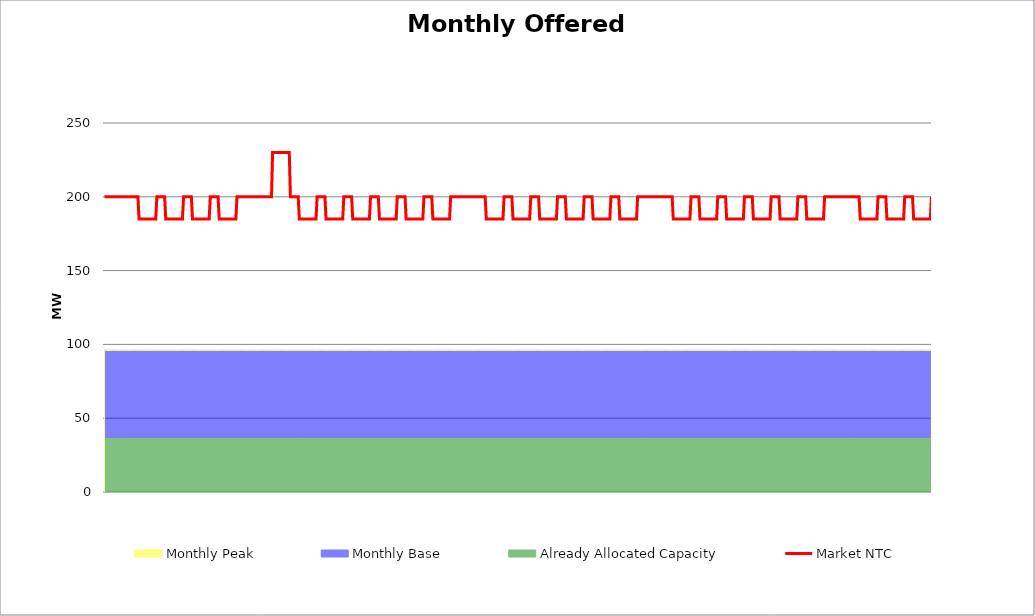
| Category | Market NTC |
|---|---|
| 0 | 200 |
| 1 | 200 |
| 2 | 200 |
| 3 | 200 |
| 4 | 200 |
| 5 | 200 |
| 6 | 200 |
| 7 | 200 |
| 8 | 200 |
| 9 | 200 |
| 10 | 200 |
| 11 | 200 |
| 12 | 200 |
| 13 | 200 |
| 14 | 200 |
| 15 | 200 |
| 16 | 200 |
| 17 | 200 |
| 18 | 200 |
| 19 | 200 |
| 20 | 200 |
| 21 | 200 |
| 22 | 200 |
| 23 | 200 |
| 24 | 200 |
| 25 | 200 |
| 26 | 200 |
| 27 | 200 |
| 28 | 200 |
| 29 | 200 |
| 30 | 200 |
| 31 | 185 |
| 32 | 185 |
| 33 | 185 |
| 34 | 185 |
| 35 | 185 |
| 36 | 185 |
| 37 | 185 |
| 38 | 185 |
| 39 | 185 |
| 40 | 185 |
| 41 | 185 |
| 42 | 185 |
| 43 | 185 |
| 44 | 185 |
| 45 | 185 |
| 46 | 185 |
| 47 | 200 |
| 48 | 200 |
| 49 | 200 |
| 50 | 200 |
| 51 | 200 |
| 52 | 200 |
| 53 | 200 |
| 54 | 200 |
| 55 | 185 |
| 56 | 185 |
| 57 | 185 |
| 58 | 185 |
| 59 | 185 |
| 60 | 185 |
| 61 | 185 |
| 62 | 185 |
| 63 | 185 |
| 64 | 185 |
| 65 | 185 |
| 66 | 185 |
| 67 | 185 |
| 68 | 185 |
| 69 | 185 |
| 70 | 185 |
| 71 | 200 |
| 72 | 200 |
| 73 | 200 |
| 74 | 200 |
| 75 | 200 |
| 76 | 200 |
| 77 | 200 |
| 78 | 200 |
| 79 | 185 |
| 80 | 185 |
| 81 | 185 |
| 82 | 185 |
| 83 | 185 |
| 84 | 185 |
| 85 | 185 |
| 86 | 185 |
| 87 | 185 |
| 88 | 185 |
| 89 | 185 |
| 90 | 185 |
| 91 | 185 |
| 92 | 185 |
| 93 | 185 |
| 94 | 185 |
| 95 | 200 |
| 96 | 200 |
| 97 | 200 |
| 98 | 200 |
| 99 | 200 |
| 100 | 200 |
| 101 | 200 |
| 102 | 200 |
| 103 | 185 |
| 104 | 185 |
| 105 | 185 |
| 106 | 185 |
| 107 | 185 |
| 108 | 185 |
| 109 | 185 |
| 110 | 185 |
| 111 | 185 |
| 112 | 185 |
| 113 | 185 |
| 114 | 185 |
| 115 | 185 |
| 116 | 185 |
| 117 | 185 |
| 118 | 185 |
| 119 | 200 |
| 120 | 200 |
| 121 | 200 |
| 122 | 200 |
| 123 | 200 |
| 124 | 200 |
| 125 | 200 |
| 126 | 200 |
| 127 | 200 |
| 128 | 200 |
| 129 | 200 |
| 130 | 200 |
| 131 | 200 |
| 132 | 200 |
| 133 | 200 |
| 134 | 200 |
| 135 | 200 |
| 136 | 200 |
| 137 | 200 |
| 138 | 200 |
| 139 | 200 |
| 140 | 200 |
| 141 | 200 |
| 142 | 200 |
| 143 | 200 |
| 144 | 200 |
| 145 | 200 |
| 146 | 200 |
| 147 | 200 |
| 148 | 200 |
| 149 | 200 |
| 150 | 200 |
| 151 | 230 |
| 152 | 230 |
| 153 | 230 |
| 154 | 230 |
| 155 | 230 |
| 156 | 230 |
| 157 | 230 |
| 158 | 230 |
| 159 | 230 |
| 160 | 230 |
| 161 | 230 |
| 162 | 230 |
| 163 | 230 |
| 164 | 230 |
| 165 | 230 |
| 166 | 230 |
| 167 | 200 |
| 168 | 200 |
| 169 | 200 |
| 170 | 200 |
| 171 | 200 |
| 172 | 200 |
| 173 | 200 |
| 174 | 200 |
| 175 | 185 |
| 176 | 185 |
| 177 | 185 |
| 178 | 185 |
| 179 | 185 |
| 180 | 185 |
| 181 | 185 |
| 182 | 185 |
| 183 | 185 |
| 184 | 185 |
| 185 | 185 |
| 186 | 185 |
| 187 | 185 |
| 188 | 185 |
| 189 | 185 |
| 190 | 185 |
| 191 | 200 |
| 192 | 200 |
| 193 | 200 |
| 194 | 200 |
| 195 | 200 |
| 196 | 200 |
| 197 | 200 |
| 198 | 200 |
| 199 | 185 |
| 200 | 185 |
| 201 | 185 |
| 202 | 185 |
| 203 | 185 |
| 204 | 185 |
| 205 | 185 |
| 206 | 185 |
| 207 | 185 |
| 208 | 185 |
| 209 | 185 |
| 210 | 185 |
| 211 | 185 |
| 212 | 185 |
| 213 | 185 |
| 214 | 185 |
| 215 | 200 |
| 216 | 200 |
| 217 | 200 |
| 218 | 200 |
| 219 | 200 |
| 220 | 200 |
| 221 | 200 |
| 222 | 200 |
| 223 | 185 |
| 224 | 185 |
| 225 | 185 |
| 226 | 185 |
| 227 | 185 |
| 228 | 185 |
| 229 | 185 |
| 230 | 185 |
| 231 | 185 |
| 232 | 185 |
| 233 | 185 |
| 234 | 185 |
| 235 | 185 |
| 236 | 185 |
| 237 | 185 |
| 238 | 185 |
| 239 | 200 |
| 240 | 200 |
| 241 | 200 |
| 242 | 200 |
| 243 | 200 |
| 244 | 200 |
| 245 | 200 |
| 246 | 200 |
| 247 | 185 |
| 248 | 185 |
| 249 | 185 |
| 250 | 185 |
| 251 | 185 |
| 252 | 185 |
| 253 | 185 |
| 254 | 185 |
| 255 | 185 |
| 256 | 185 |
| 257 | 185 |
| 258 | 185 |
| 259 | 185 |
| 260 | 185 |
| 261 | 185 |
| 262 | 185 |
| 263 | 200 |
| 264 | 200 |
| 265 | 200 |
| 266 | 200 |
| 267 | 200 |
| 268 | 200 |
| 269 | 200 |
| 270 | 200 |
| 271 | 185 |
| 272 | 185 |
| 273 | 185 |
| 274 | 185 |
| 275 | 185 |
| 276 | 185 |
| 277 | 185 |
| 278 | 185 |
| 279 | 185 |
| 280 | 185 |
| 281 | 185 |
| 282 | 185 |
| 283 | 185 |
| 284 | 185 |
| 285 | 185 |
| 286 | 185 |
| 287 | 200 |
| 288 | 200 |
| 289 | 200 |
| 290 | 200 |
| 291 | 200 |
| 292 | 200 |
| 293 | 200 |
| 294 | 200 |
| 295 | 185 |
| 296 | 185 |
| 297 | 185 |
| 298 | 185 |
| 299 | 185 |
| 300 | 185 |
| 301 | 185 |
| 302 | 185 |
| 303 | 185 |
| 304 | 185 |
| 305 | 185 |
| 306 | 185 |
| 307 | 185 |
| 308 | 185 |
| 309 | 185 |
| 310 | 185 |
| 311 | 200 |
| 312 | 200 |
| 313 | 200 |
| 314 | 200 |
| 315 | 200 |
| 316 | 200 |
| 317 | 200 |
| 318 | 200 |
| 319 | 200 |
| 320 | 200 |
| 321 | 200 |
| 322 | 200 |
| 323 | 200 |
| 324 | 200 |
| 325 | 200 |
| 326 | 200 |
| 327 | 200 |
| 328 | 200 |
| 329 | 200 |
| 330 | 200 |
| 331 | 200 |
| 332 | 200 |
| 333 | 200 |
| 334 | 200 |
| 335 | 200 |
| 336 | 200 |
| 337 | 200 |
| 338 | 200 |
| 339 | 200 |
| 340 | 200 |
| 341 | 200 |
| 342 | 200 |
| 343 | 185 |
| 344 | 185 |
| 345 | 185 |
| 346 | 185 |
| 347 | 185 |
| 348 | 185 |
| 349 | 185 |
| 350 | 185 |
| 351 | 185 |
| 352 | 185 |
| 353 | 185 |
| 354 | 185 |
| 355 | 185 |
| 356 | 185 |
| 357 | 185 |
| 358 | 185 |
| 359 | 200 |
| 360 | 200 |
| 361 | 200 |
| 362 | 200 |
| 363 | 200 |
| 364 | 200 |
| 365 | 200 |
| 366 | 200 |
| 367 | 185 |
| 368 | 185 |
| 369 | 185 |
| 370 | 185 |
| 371 | 185 |
| 372 | 185 |
| 373 | 185 |
| 374 | 185 |
| 375 | 185 |
| 376 | 185 |
| 377 | 185 |
| 378 | 185 |
| 379 | 185 |
| 380 | 185 |
| 381 | 185 |
| 382 | 185 |
| 383 | 200 |
| 384 | 200 |
| 385 | 200 |
| 386 | 200 |
| 387 | 200 |
| 388 | 200 |
| 389 | 200 |
| 390 | 200 |
| 391 | 185 |
| 392 | 185 |
| 393 | 185 |
| 394 | 185 |
| 395 | 185 |
| 396 | 185 |
| 397 | 185 |
| 398 | 185 |
| 399 | 185 |
| 400 | 185 |
| 401 | 185 |
| 402 | 185 |
| 403 | 185 |
| 404 | 185 |
| 405 | 185 |
| 406 | 185 |
| 407 | 200 |
| 408 | 200 |
| 409 | 200 |
| 410 | 200 |
| 411 | 200 |
| 412 | 200 |
| 413 | 200 |
| 414 | 200 |
| 415 | 185 |
| 416 | 185 |
| 417 | 185 |
| 418 | 185 |
| 419 | 185 |
| 420 | 185 |
| 421 | 185 |
| 422 | 185 |
| 423 | 185 |
| 424 | 185 |
| 425 | 185 |
| 426 | 185 |
| 427 | 185 |
| 428 | 185 |
| 429 | 185 |
| 430 | 185 |
| 431 | 200 |
| 432 | 200 |
| 433 | 200 |
| 434 | 200 |
| 435 | 200 |
| 436 | 200 |
| 437 | 200 |
| 438 | 200 |
| 439 | 185 |
| 440 | 185 |
| 441 | 185 |
| 442 | 185 |
| 443 | 185 |
| 444 | 185 |
| 445 | 185 |
| 446 | 185 |
| 447 | 185 |
| 448 | 185 |
| 449 | 185 |
| 450 | 185 |
| 451 | 185 |
| 452 | 185 |
| 453 | 185 |
| 454 | 185 |
| 455 | 200 |
| 456 | 200 |
| 457 | 200 |
| 458 | 200 |
| 459 | 200 |
| 460 | 200 |
| 461 | 200 |
| 462 | 200 |
| 463 | 185 |
| 464 | 185 |
| 465 | 185 |
| 466 | 185 |
| 467 | 185 |
| 468 | 185 |
| 469 | 185 |
| 470 | 185 |
| 471 | 185 |
| 472 | 185 |
| 473 | 185 |
| 474 | 185 |
| 475 | 185 |
| 476 | 185 |
| 477 | 185 |
| 478 | 185 |
| 479 | 200 |
| 480 | 200 |
| 481 | 200 |
| 482 | 200 |
| 483 | 200 |
| 484 | 200 |
| 485 | 200 |
| 486 | 200 |
| 487 | 200 |
| 488 | 200 |
| 489 | 200 |
| 490 | 200 |
| 491 | 200 |
| 492 | 200 |
| 493 | 200 |
| 494 | 200 |
| 495 | 200 |
| 496 | 200 |
| 497 | 200 |
| 498 | 200 |
| 499 | 200 |
| 500 | 200 |
| 501 | 200 |
| 502 | 200 |
| 503 | 200 |
| 504 | 200 |
| 505 | 200 |
| 506 | 200 |
| 507 | 200 |
| 508 | 200 |
| 509 | 200 |
| 510 | 200 |
| 511 | 185 |
| 512 | 185 |
| 513 | 185 |
| 514 | 185 |
| 515 | 185 |
| 516 | 185 |
| 517 | 185 |
| 518 | 185 |
| 519 | 185 |
| 520 | 185 |
| 521 | 185 |
| 522 | 185 |
| 523 | 185 |
| 524 | 185 |
| 525 | 185 |
| 526 | 185 |
| 527 | 200 |
| 528 | 200 |
| 529 | 200 |
| 530 | 200 |
| 531 | 200 |
| 532 | 200 |
| 533 | 200 |
| 534 | 200 |
| 535 | 185 |
| 536 | 185 |
| 537 | 185 |
| 538 | 185 |
| 539 | 185 |
| 540 | 185 |
| 541 | 185 |
| 542 | 185 |
| 543 | 185 |
| 544 | 185 |
| 545 | 185 |
| 546 | 185 |
| 547 | 185 |
| 548 | 185 |
| 549 | 185 |
| 550 | 185 |
| 551 | 200 |
| 552 | 200 |
| 553 | 200 |
| 554 | 200 |
| 555 | 200 |
| 556 | 200 |
| 557 | 200 |
| 558 | 200 |
| 559 | 185 |
| 560 | 185 |
| 561 | 185 |
| 562 | 185 |
| 563 | 185 |
| 564 | 185 |
| 565 | 185 |
| 566 | 185 |
| 567 | 185 |
| 568 | 185 |
| 569 | 185 |
| 570 | 185 |
| 571 | 185 |
| 572 | 185 |
| 573 | 185 |
| 574 | 185 |
| 575 | 200 |
| 576 | 200 |
| 577 | 200 |
| 578 | 200 |
| 579 | 200 |
| 580 | 200 |
| 581 | 200 |
| 582 | 200 |
| 583 | 185 |
| 584 | 185 |
| 585 | 185 |
| 586 | 185 |
| 587 | 185 |
| 588 | 185 |
| 589 | 185 |
| 590 | 185 |
| 591 | 185 |
| 592 | 185 |
| 593 | 185 |
| 594 | 185 |
| 595 | 185 |
| 596 | 185 |
| 597 | 185 |
| 598 | 185 |
| 599 | 200 |
| 600 | 200 |
| 601 | 200 |
| 602 | 200 |
| 603 | 200 |
| 604 | 200 |
| 605 | 200 |
| 606 | 200 |
| 607 | 185 |
| 608 | 185 |
| 609 | 185 |
| 610 | 185 |
| 611 | 185 |
| 612 | 185 |
| 613 | 185 |
| 614 | 185 |
| 615 | 185 |
| 616 | 185 |
| 617 | 185 |
| 618 | 185 |
| 619 | 185 |
| 620 | 185 |
| 621 | 185 |
| 622 | 185 |
| 623 | 200 |
| 624 | 200 |
| 625 | 200 |
| 626 | 200 |
| 627 | 200 |
| 628 | 200 |
| 629 | 200 |
| 630 | 200 |
| 631 | 185 |
| 632 | 185 |
| 633 | 185 |
| 634 | 185 |
| 635 | 185 |
| 636 | 185 |
| 637 | 185 |
| 638 | 185 |
| 639 | 185 |
| 640 | 185 |
| 641 | 185 |
| 642 | 185 |
| 643 | 185 |
| 644 | 185 |
| 645 | 185 |
| 646 | 185 |
| 647 | 200 |
| 648 | 200 |
| 649 | 200 |
| 650 | 200 |
| 651 | 200 |
| 652 | 200 |
| 653 | 200 |
| 654 | 200 |
| 655 | 200 |
| 656 | 200 |
| 657 | 200 |
| 658 | 200 |
| 659 | 200 |
| 660 | 200 |
| 661 | 200 |
| 662 | 200 |
| 663 | 200 |
| 664 | 200 |
| 665 | 200 |
| 666 | 200 |
| 667 | 200 |
| 668 | 200 |
| 669 | 200 |
| 670 | 200 |
| 671 | 200 |
| 672 | 200 |
| 673 | 200 |
| 674 | 200 |
| 675 | 200 |
| 676 | 200 |
| 677 | 200 |
| 678 | 200 |
| 679 | 185 |
| 680 | 185 |
| 681 | 185 |
| 682 | 185 |
| 683 | 185 |
| 684 | 185 |
| 685 | 185 |
| 686 | 185 |
| 687 | 185 |
| 688 | 185 |
| 689 | 185 |
| 690 | 185 |
| 691 | 185 |
| 692 | 185 |
| 693 | 185 |
| 694 | 185 |
| 695 | 200 |
| 696 | 200 |
| 697 | 200 |
| 698 | 200 |
| 699 | 200 |
| 700 | 200 |
| 701 | 200 |
| 702 | 200 |
| 703 | 185 |
| 704 | 185 |
| 705 | 185 |
| 706 | 185 |
| 707 | 185 |
| 708 | 185 |
| 709 | 185 |
| 710 | 185 |
| 711 | 185 |
| 712 | 185 |
| 713 | 185 |
| 714 | 185 |
| 715 | 185 |
| 716 | 185 |
| 717 | 185 |
| 718 | 185 |
| 719 | 200 |
| 720 | 200 |
| 721 | 200 |
| 722 | 200 |
| 723 | 200 |
| 724 | 200 |
| 725 | 200 |
| 726 | 200 |
| 727 | 185 |
| 728 | 185 |
| 729 | 185 |
| 730 | 185 |
| 731 | 185 |
| 732 | 185 |
| 733 | 185 |
| 734 | 185 |
| 735 | 185 |
| 736 | 185 |
| 737 | 185 |
| 738 | 185 |
| 739 | 185 |
| 740 | 185 |
| 741 | 185 |
| 742 | 185 |
| 743 | 200 |